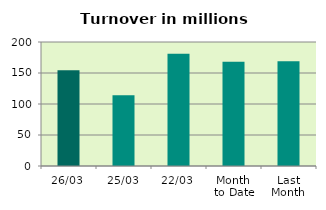
| Category | Series 0 |
|---|---|
| 26/03 | 154.281 |
| 25/03 | 113.942 |
| 22/03 | 180.985 |
| Month 
to Date | 168.259 |
| Last
Month | 168.971 |